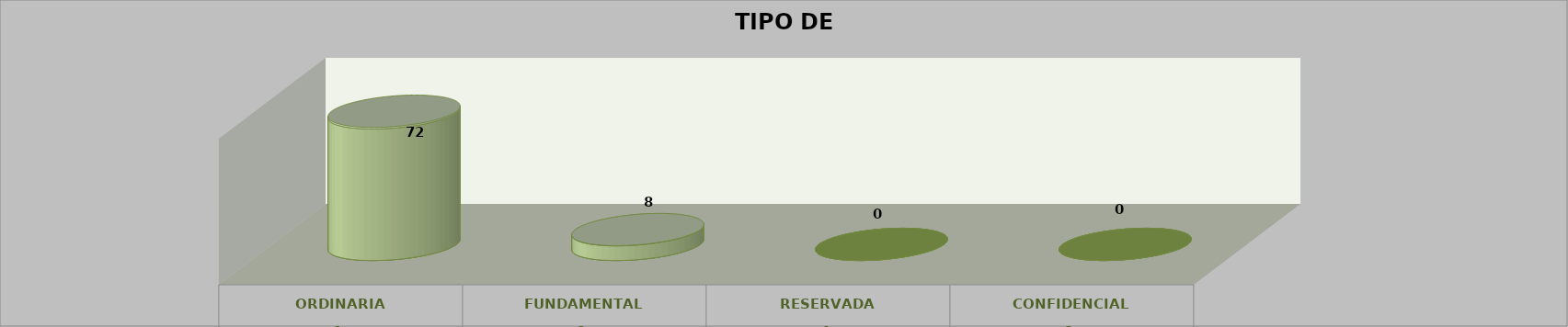
| Category | Series 0 | Series 2 | Series 1 | Series 3 | Series 4 |
|---|---|---|---|---|---|
| 0 |  |  |  | 72 | 0.9 |
| 1 |  |  |  | 8 | 0.1 |
| 2 |  |  |  | 0 | 0 |
| 3 |  |  |  | 0 | 0 |